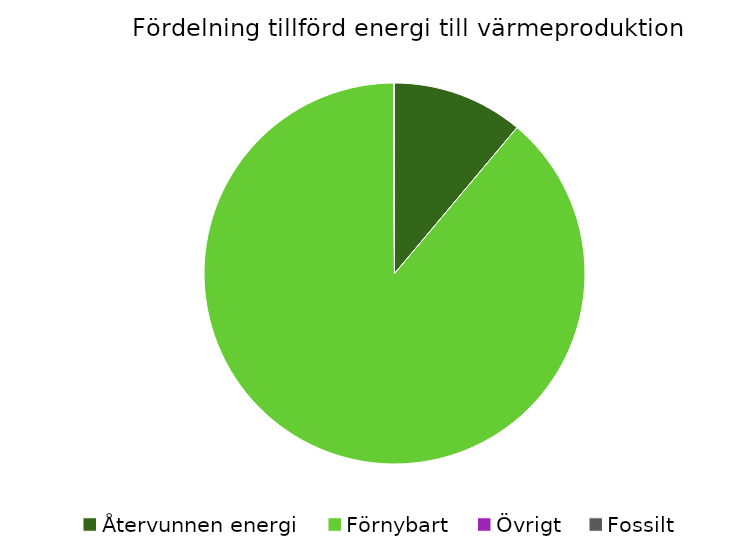
| Category | Fördelning värmeproduktion |
|---|---|
| Återvunnen energi | 0.111 |
| Förnybart | 0.888 |
| Övrigt | 0 |
| Fossilt | 0.001 |